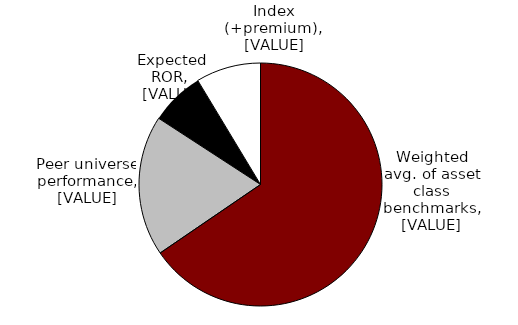
| Category | Series 0 |
|---|---|
| Weighted average of asset class benchmarks | 0.655 |
| Peer universe performance | 0.187 |
| Expected ROR | 0.072 |
| Index (+premium) | 0.086 |